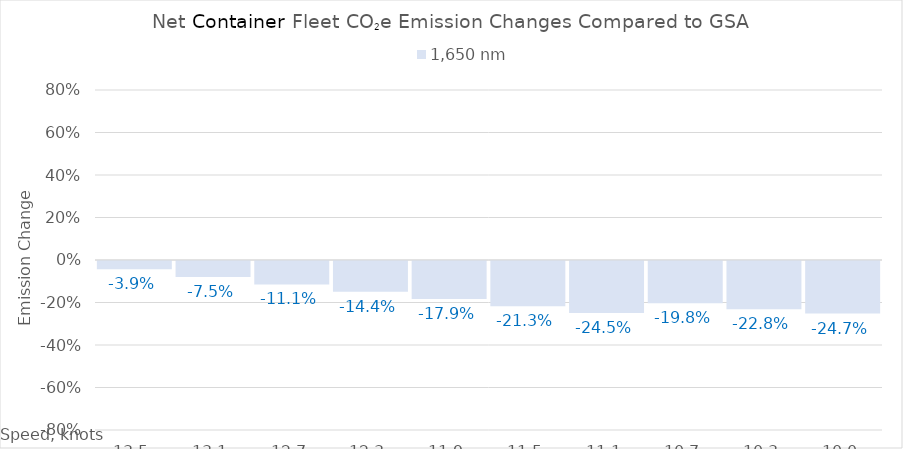
| Category | 1,650 |
|---|---|
| 13.5 | -0.039 |
| 13.1 | -0.075 |
| 12.7 | -0.111 |
| 12.299999999999999 | -0.144 |
| 11.899999999999999 | -0.179 |
| 11.499999999999998 | -0.213 |
| 11.099999999999998 | -0.245 |
| 10.699999999999998 | -0.198 |
| 10.299999999999997 | -0.228 |
| 10.0 | -0.247 |